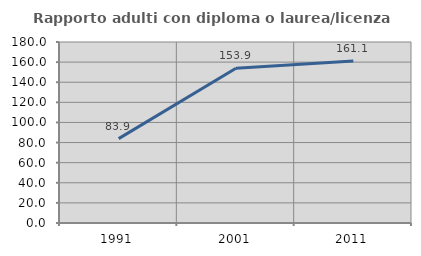
| Category | Rapporto adulti con diploma o laurea/licenza media  |
|---|---|
| 1991.0 | 83.889 |
| 2001.0 | 153.867 |
| 2011.0 | 161.137 |